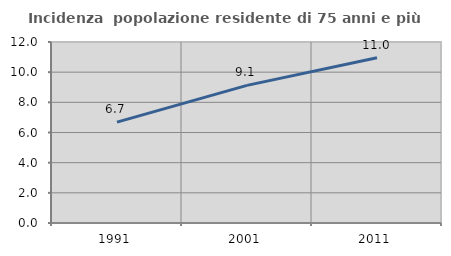
| Category | Incidenza  popolazione residente di 75 anni e più |
|---|---|
| 1991.0 | 6.689 |
| 2001.0 | 9.126 |
| 2011.0 | 10.956 |